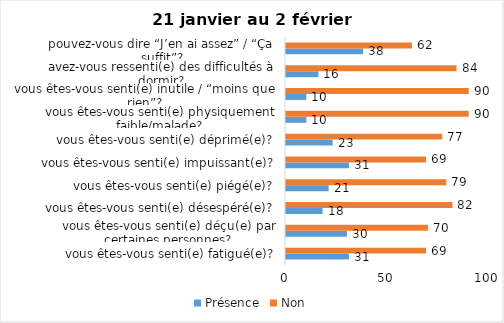
| Category | Présence | Non |
|---|---|---|
| vous êtes-vous senti(e) fatigué(e)? | 31 | 69 |
| vous êtes-vous senti(e) déçu(e) par certaines personnes? | 30 | 70 |
| vous êtes-vous senti(e) désespéré(e)? | 18 | 82 |
| vous êtes-vous senti(e) piégé(e)? | 21 | 79 |
| vous êtes-vous senti(e) impuissant(e)? | 31 | 69 |
| vous êtes-vous senti(e) déprimé(e)? | 23 | 77 |
| vous êtes-vous senti(e) physiquement faible/malade? | 10 | 90 |
| vous êtes-vous senti(e) inutile / “moins que rien”? | 10 | 90 |
| avez-vous ressenti(e) des difficultés à dormir? | 16 | 84 |
| pouvez-vous dire “J’en ai assez” / “Ça suffit”? | 38 | 62 |